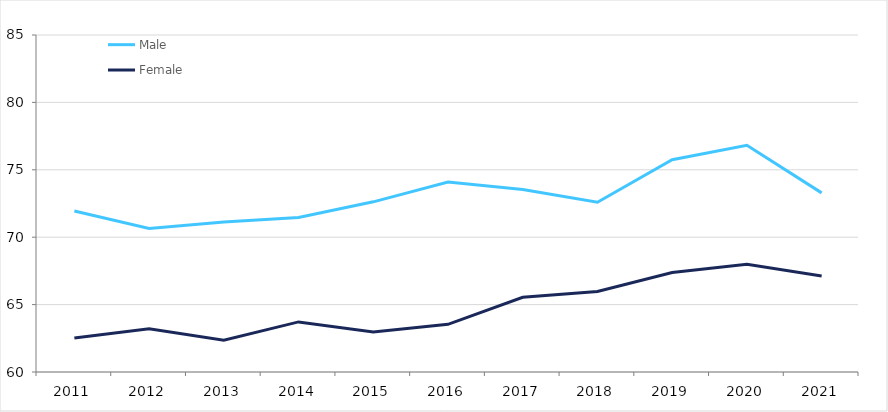
| Category | Male | Female |
|---|---|---|
| 2011.0 | 71.941 | 62.515 |
| 2012.0 | 70.654 | 63.207 |
| 2013.0 | 71.131 | 62.356 |
| 2014.0 | 71.459 | 63.715 |
| 2015.0 | 72.623 | 62.961 |
| 2016.0 | 74.096 | 63.535 |
| 2017.0 | 73.535 | 65.538 |
| 2018.0 | 72.596 | 65.967 |
| 2019.0 | 75.746 | 67.375 |
| 2020.0 | 76.819 | 67.985 |
| 2021.0 | 73.289 | 67.115 |